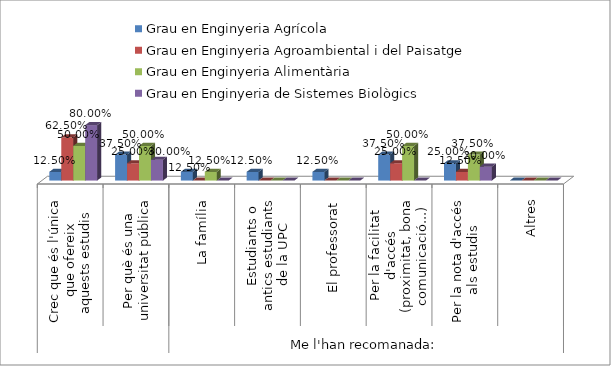
| Category | Grau en Enginyeria Agrícola | Grau en Enginyeria Agroambiental i del Paisatge | Grau en Enginyeria Alimentària | Grau en Enginyeria de Sistemes Biològics |
|---|---|---|---|---|
| 0 | 0.125 | 0.625 | 0.5 | 0.8 |
| 1 | 0.375 | 0.25 | 0.5 | 0.3 |
| 2 | 0.125 | 0 | 0.125 | 0 |
| 3 | 0.125 | 0 | 0 | 0 |
| 4 | 0.125 | 0 | 0 | 0 |
| 5 | 0.375 | 0.25 | 0.5 | 0 |
| 6 | 0.25 | 0.125 | 0.375 | 0.2 |
| 7 | 0 | 0 | 0 | 0 |